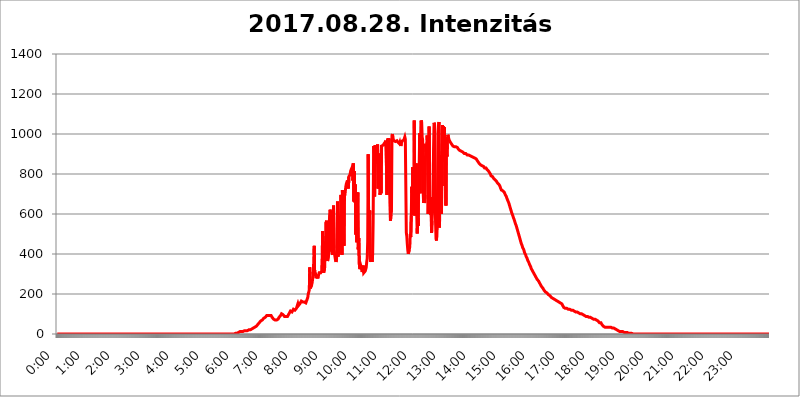
| Category | 2017.08.28. Intenzitás [W/m^2] |
|---|---|
| 0.0 | 0 |
| 0.0006944444444444445 | 0 |
| 0.001388888888888889 | 0 |
| 0.0020833333333333333 | 0 |
| 0.002777777777777778 | 0 |
| 0.003472222222222222 | 0 |
| 0.004166666666666667 | 0 |
| 0.004861111111111111 | 0 |
| 0.005555555555555556 | 0 |
| 0.0062499999999999995 | 0 |
| 0.006944444444444444 | 0 |
| 0.007638888888888889 | 0 |
| 0.008333333333333333 | 0 |
| 0.009027777777777779 | 0 |
| 0.009722222222222222 | 0 |
| 0.010416666666666666 | 0 |
| 0.011111111111111112 | 0 |
| 0.011805555555555555 | 0 |
| 0.012499999999999999 | 0 |
| 0.013194444444444444 | 0 |
| 0.013888888888888888 | 0 |
| 0.014583333333333332 | 0 |
| 0.015277777777777777 | 0 |
| 0.015972222222222224 | 0 |
| 0.016666666666666666 | 0 |
| 0.017361111111111112 | 0 |
| 0.018055555555555557 | 0 |
| 0.01875 | 0 |
| 0.019444444444444445 | 0 |
| 0.02013888888888889 | 0 |
| 0.020833333333333332 | 0 |
| 0.02152777777777778 | 0 |
| 0.022222222222222223 | 0 |
| 0.02291666666666667 | 0 |
| 0.02361111111111111 | 0 |
| 0.024305555555555556 | 0 |
| 0.024999999999999998 | 0 |
| 0.025694444444444447 | 0 |
| 0.02638888888888889 | 0 |
| 0.027083333333333334 | 0 |
| 0.027777777777777776 | 0 |
| 0.02847222222222222 | 0 |
| 0.029166666666666664 | 0 |
| 0.029861111111111113 | 0 |
| 0.030555555555555555 | 0 |
| 0.03125 | 0 |
| 0.03194444444444445 | 0 |
| 0.03263888888888889 | 0 |
| 0.03333333333333333 | 0 |
| 0.034027777777777775 | 0 |
| 0.034722222222222224 | 0 |
| 0.035416666666666666 | 0 |
| 0.036111111111111115 | 0 |
| 0.03680555555555556 | 0 |
| 0.0375 | 0 |
| 0.03819444444444444 | 0 |
| 0.03888888888888889 | 0 |
| 0.03958333333333333 | 0 |
| 0.04027777777777778 | 0 |
| 0.04097222222222222 | 0 |
| 0.041666666666666664 | 0 |
| 0.042361111111111106 | 0 |
| 0.04305555555555556 | 0 |
| 0.043750000000000004 | 0 |
| 0.044444444444444446 | 0 |
| 0.04513888888888889 | 0 |
| 0.04583333333333334 | 0 |
| 0.04652777777777778 | 0 |
| 0.04722222222222222 | 0 |
| 0.04791666666666666 | 0 |
| 0.04861111111111111 | 0 |
| 0.049305555555555554 | 0 |
| 0.049999999999999996 | 0 |
| 0.05069444444444445 | 0 |
| 0.051388888888888894 | 0 |
| 0.052083333333333336 | 0 |
| 0.05277777777777778 | 0 |
| 0.05347222222222222 | 0 |
| 0.05416666666666667 | 0 |
| 0.05486111111111111 | 0 |
| 0.05555555555555555 | 0 |
| 0.05625 | 0 |
| 0.05694444444444444 | 0 |
| 0.057638888888888885 | 0 |
| 0.05833333333333333 | 0 |
| 0.05902777777777778 | 0 |
| 0.059722222222222225 | 0 |
| 0.06041666666666667 | 0 |
| 0.061111111111111116 | 0 |
| 0.06180555555555556 | 0 |
| 0.0625 | 0 |
| 0.06319444444444444 | 0 |
| 0.06388888888888888 | 0 |
| 0.06458333333333334 | 0 |
| 0.06527777777777778 | 0 |
| 0.06597222222222222 | 0 |
| 0.06666666666666667 | 0 |
| 0.06736111111111111 | 0 |
| 0.06805555555555555 | 0 |
| 0.06874999999999999 | 0 |
| 0.06944444444444443 | 0 |
| 0.07013888888888889 | 0 |
| 0.07083333333333333 | 0 |
| 0.07152777777777779 | 0 |
| 0.07222222222222223 | 0 |
| 0.07291666666666667 | 0 |
| 0.07361111111111111 | 0 |
| 0.07430555555555556 | 0 |
| 0.075 | 0 |
| 0.07569444444444444 | 0 |
| 0.0763888888888889 | 0 |
| 0.07708333333333334 | 0 |
| 0.07777777777777778 | 0 |
| 0.07847222222222222 | 0 |
| 0.07916666666666666 | 0 |
| 0.0798611111111111 | 0 |
| 0.08055555555555556 | 0 |
| 0.08125 | 0 |
| 0.08194444444444444 | 0 |
| 0.08263888888888889 | 0 |
| 0.08333333333333333 | 0 |
| 0.08402777777777777 | 0 |
| 0.08472222222222221 | 0 |
| 0.08541666666666665 | 0 |
| 0.08611111111111112 | 0 |
| 0.08680555555555557 | 0 |
| 0.08750000000000001 | 0 |
| 0.08819444444444445 | 0 |
| 0.08888888888888889 | 0 |
| 0.08958333333333333 | 0 |
| 0.09027777777777778 | 0 |
| 0.09097222222222222 | 0 |
| 0.09166666666666667 | 0 |
| 0.09236111111111112 | 0 |
| 0.09305555555555556 | 0 |
| 0.09375 | 0 |
| 0.09444444444444444 | 0 |
| 0.09513888888888888 | 0 |
| 0.09583333333333333 | 0 |
| 0.09652777777777777 | 0 |
| 0.09722222222222222 | 0 |
| 0.09791666666666667 | 0 |
| 0.09861111111111111 | 0 |
| 0.09930555555555555 | 0 |
| 0.09999999999999999 | 0 |
| 0.10069444444444443 | 0 |
| 0.1013888888888889 | 0 |
| 0.10208333333333335 | 0 |
| 0.10277777777777779 | 0 |
| 0.10347222222222223 | 0 |
| 0.10416666666666667 | 0 |
| 0.10486111111111111 | 0 |
| 0.10555555555555556 | 0 |
| 0.10625 | 0 |
| 0.10694444444444444 | 0 |
| 0.1076388888888889 | 0 |
| 0.10833333333333334 | 0 |
| 0.10902777777777778 | 0 |
| 0.10972222222222222 | 0 |
| 0.1111111111111111 | 0 |
| 0.11180555555555556 | 0 |
| 0.11180555555555556 | 0 |
| 0.1125 | 0 |
| 0.11319444444444444 | 0 |
| 0.11388888888888889 | 0 |
| 0.11458333333333333 | 0 |
| 0.11527777777777777 | 0 |
| 0.11597222222222221 | 0 |
| 0.11666666666666665 | 0 |
| 0.1173611111111111 | 0 |
| 0.11805555555555557 | 0 |
| 0.11944444444444445 | 0 |
| 0.12013888888888889 | 0 |
| 0.12083333333333333 | 0 |
| 0.12152777777777778 | 0 |
| 0.12222222222222223 | 0 |
| 0.12291666666666667 | 0 |
| 0.12291666666666667 | 0 |
| 0.12361111111111112 | 0 |
| 0.12430555555555556 | 0 |
| 0.125 | 0 |
| 0.12569444444444444 | 0 |
| 0.12638888888888888 | 0 |
| 0.12708333333333333 | 0 |
| 0.16875 | 0 |
| 0.12847222222222224 | 0 |
| 0.12916666666666668 | 0 |
| 0.12986111111111112 | 0 |
| 0.13055555555555556 | 0 |
| 0.13125 | 0 |
| 0.13194444444444445 | 0 |
| 0.1326388888888889 | 0 |
| 0.13333333333333333 | 0 |
| 0.13402777777777777 | 0 |
| 0.13402777777777777 | 0 |
| 0.13472222222222222 | 0 |
| 0.13541666666666666 | 0 |
| 0.1361111111111111 | 0 |
| 0.13749999999999998 | 0 |
| 0.13819444444444443 | 0 |
| 0.1388888888888889 | 0 |
| 0.13958333333333334 | 0 |
| 0.14027777777777778 | 0 |
| 0.14097222222222222 | 0 |
| 0.14166666666666666 | 0 |
| 0.1423611111111111 | 0 |
| 0.14305555555555557 | 0 |
| 0.14375000000000002 | 0 |
| 0.14444444444444446 | 0 |
| 0.1451388888888889 | 0 |
| 0.1451388888888889 | 0 |
| 0.14652777777777778 | 0 |
| 0.14722222222222223 | 0 |
| 0.14791666666666667 | 0 |
| 0.1486111111111111 | 0 |
| 0.14930555555555555 | 0 |
| 0.15 | 0 |
| 0.15069444444444444 | 0 |
| 0.15138888888888888 | 0 |
| 0.15208333333333332 | 0 |
| 0.15277777777777776 | 0 |
| 0.15347222222222223 | 0 |
| 0.15416666666666667 | 0 |
| 0.15486111111111112 | 0 |
| 0.15555555555555556 | 0 |
| 0.15625 | 0 |
| 0.15694444444444444 | 0 |
| 0.15763888888888888 | 0 |
| 0.15833333333333333 | 0 |
| 0.15902777777777777 | 0 |
| 0.15972222222222224 | 0 |
| 0.16041666666666668 | 0 |
| 0.16111111111111112 | 0 |
| 0.16180555555555556 | 0 |
| 0.1625 | 0 |
| 0.16319444444444445 | 0 |
| 0.1638888888888889 | 0 |
| 0.16458333333333333 | 0 |
| 0.16527777777777777 | 0 |
| 0.16597222222222222 | 0 |
| 0.16666666666666666 | 0 |
| 0.1673611111111111 | 0 |
| 0.16805555555555554 | 0 |
| 0.16874999999999998 | 0 |
| 0.16944444444444443 | 0 |
| 0.17013888888888887 | 0 |
| 0.1708333333333333 | 0 |
| 0.17152777777777775 | 0 |
| 0.17222222222222225 | 0 |
| 0.1729166666666667 | 0 |
| 0.17361111111111113 | 0 |
| 0.17430555555555557 | 0 |
| 0.17500000000000002 | 0 |
| 0.17569444444444446 | 0 |
| 0.1763888888888889 | 0 |
| 0.17708333333333334 | 0 |
| 0.17777777777777778 | 0 |
| 0.17847222222222223 | 0 |
| 0.17916666666666667 | 0 |
| 0.1798611111111111 | 0 |
| 0.18055555555555555 | 0 |
| 0.18125 | 0 |
| 0.18194444444444444 | 0 |
| 0.1826388888888889 | 0 |
| 0.18333333333333335 | 0 |
| 0.1840277777777778 | 0 |
| 0.18472222222222223 | 0 |
| 0.18541666666666667 | 0 |
| 0.18611111111111112 | 0 |
| 0.18680555555555556 | 0 |
| 0.1875 | 0 |
| 0.18819444444444444 | 0 |
| 0.18888888888888888 | 0 |
| 0.18958333333333333 | 0 |
| 0.19027777777777777 | 0 |
| 0.1909722222222222 | 0 |
| 0.19166666666666665 | 0 |
| 0.19236111111111112 | 0 |
| 0.19305555555555554 | 0 |
| 0.19375 | 0 |
| 0.19444444444444445 | 0 |
| 0.1951388888888889 | 0 |
| 0.19583333333333333 | 0 |
| 0.19652777777777777 | 0 |
| 0.19722222222222222 | 0 |
| 0.19791666666666666 | 0 |
| 0.1986111111111111 | 0 |
| 0.19930555555555554 | 0 |
| 0.19999999999999998 | 0 |
| 0.20069444444444443 | 0 |
| 0.20138888888888887 | 0 |
| 0.2020833333333333 | 0 |
| 0.2027777777777778 | 0 |
| 0.2034722222222222 | 0 |
| 0.2041666666666667 | 0 |
| 0.20486111111111113 | 0 |
| 0.20555555555555557 | 0 |
| 0.20625000000000002 | 0 |
| 0.20694444444444446 | 0 |
| 0.2076388888888889 | 0 |
| 0.20833333333333334 | 0 |
| 0.20902777777777778 | 0 |
| 0.20972222222222223 | 0 |
| 0.21041666666666667 | 0 |
| 0.2111111111111111 | 0 |
| 0.21180555555555555 | 0 |
| 0.2125 | 0 |
| 0.21319444444444444 | 0 |
| 0.2138888888888889 | 0 |
| 0.21458333333333335 | 0 |
| 0.2152777777777778 | 0 |
| 0.21597222222222223 | 0 |
| 0.21666666666666667 | 0 |
| 0.21736111111111112 | 0 |
| 0.21805555555555556 | 0 |
| 0.21875 | 0 |
| 0.21944444444444444 | 0 |
| 0.22013888888888888 | 0 |
| 0.22083333333333333 | 0 |
| 0.22152777777777777 | 0 |
| 0.2222222222222222 | 0 |
| 0.22291666666666665 | 0 |
| 0.2236111111111111 | 0 |
| 0.22430555555555556 | 0 |
| 0.225 | 0 |
| 0.22569444444444445 | 0 |
| 0.2263888888888889 | 0 |
| 0.22708333333333333 | 0 |
| 0.22777777777777777 | 0 |
| 0.22847222222222222 | 0 |
| 0.22916666666666666 | 0 |
| 0.2298611111111111 | 0 |
| 0.23055555555555554 | 0 |
| 0.23124999999999998 | 0 |
| 0.23194444444444443 | 0 |
| 0.23263888888888887 | 0 |
| 0.2333333333333333 | 0 |
| 0.2340277777777778 | 0 |
| 0.2347222222222222 | 0 |
| 0.2354166666666667 | 0 |
| 0.23611111111111113 | 0 |
| 0.23680555555555557 | 0 |
| 0.23750000000000002 | 0 |
| 0.23819444444444446 | 0 |
| 0.2388888888888889 | 0 |
| 0.23958333333333334 | 0 |
| 0.24027777777777778 | 0 |
| 0.24097222222222223 | 0 |
| 0.24166666666666667 | 0 |
| 0.2423611111111111 | 0 |
| 0.24305555555555555 | 0 |
| 0.24375 | 0 |
| 0.24444444444444446 | 0 |
| 0.24513888888888888 | 0 |
| 0.24583333333333335 | 0 |
| 0.2465277777777778 | 0 |
| 0.24722222222222223 | 0 |
| 0.24791666666666667 | 0 |
| 0.24861111111111112 | 0 |
| 0.24930555555555556 | 3.525 |
| 0.25 | 3.525 |
| 0.25069444444444444 | 3.525 |
| 0.2513888888888889 | 3.525 |
| 0.2520833333333333 | 3.525 |
| 0.25277777777777777 | 3.525 |
| 0.2534722222222222 | 3.525 |
| 0.25416666666666665 | 7.887 |
| 0.2548611111111111 | 7.887 |
| 0.2555555555555556 | 7.887 |
| 0.25625000000000003 | 12.257 |
| 0.2569444444444445 | 12.257 |
| 0.2576388888888889 | 12.257 |
| 0.25833333333333336 | 12.257 |
| 0.2590277777777778 | 12.257 |
| 0.25972222222222224 | 12.257 |
| 0.2604166666666667 | 12.257 |
| 0.2611111111111111 | 16.636 |
| 0.26180555555555557 | 16.636 |
| 0.2625 | 16.636 |
| 0.26319444444444445 | 16.636 |
| 0.2638888888888889 | 16.636 |
| 0.26458333333333334 | 16.636 |
| 0.2652777777777778 | 16.636 |
| 0.2659722222222222 | 16.636 |
| 0.26666666666666666 | 16.636 |
| 0.2673611111111111 | 21.024 |
| 0.26805555555555555 | 21.024 |
| 0.26875 | 21.024 |
| 0.26944444444444443 | 21.024 |
| 0.2701388888888889 | 21.024 |
| 0.2708333333333333 | 21.024 |
| 0.27152777777777776 | 25.419 |
| 0.2722222222222222 | 25.419 |
| 0.27291666666666664 | 25.419 |
| 0.2736111111111111 | 29.823 |
| 0.2743055555555555 | 29.823 |
| 0.27499999999999997 | 29.823 |
| 0.27569444444444446 | 34.234 |
| 0.27638888888888885 | 34.234 |
| 0.27708333333333335 | 34.234 |
| 0.2777777777777778 | 38.653 |
| 0.27847222222222223 | 38.653 |
| 0.2791666666666667 | 38.653 |
| 0.2798611111111111 | 43.079 |
| 0.28055555555555556 | 43.079 |
| 0.28125 | 47.511 |
| 0.28194444444444444 | 51.951 |
| 0.2826388888888889 | 51.951 |
| 0.2833333333333333 | 56.398 |
| 0.28402777777777777 | 60.85 |
| 0.2847222222222222 | 60.85 |
| 0.28541666666666665 | 65.31 |
| 0.28611111111111115 | 65.31 |
| 0.28680555555555554 | 69.775 |
| 0.28750000000000003 | 69.775 |
| 0.2881944444444445 | 74.246 |
| 0.2888888888888889 | 74.246 |
| 0.28958333333333336 | 78.722 |
| 0.2902777777777778 | 83.205 |
| 0.29097222222222224 | 83.205 |
| 0.2916666666666667 | 83.205 |
| 0.2923611111111111 | 87.692 |
| 0.29305555555555557 | 87.692 |
| 0.29375 | 92.184 |
| 0.29444444444444445 | 87.692 |
| 0.2951388888888889 | 87.692 |
| 0.29583333333333334 | 92.184 |
| 0.2965277777777778 | 92.184 |
| 0.2972222222222222 | 92.184 |
| 0.29791666666666666 | 92.184 |
| 0.2986111111111111 | 96.682 |
| 0.29930555555555555 | 96.682 |
| 0.3 | 92.184 |
| 0.30069444444444443 | 87.692 |
| 0.3013888888888889 | 83.205 |
| 0.3020833333333333 | 83.205 |
| 0.30277777777777776 | 78.722 |
| 0.3034722222222222 | 74.246 |
| 0.30416666666666664 | 69.775 |
| 0.3048611111111111 | 69.775 |
| 0.3055555555555555 | 69.775 |
| 0.30624999999999997 | 69.775 |
| 0.3069444444444444 | 69.775 |
| 0.3076388888888889 | 69.775 |
| 0.30833333333333335 | 69.775 |
| 0.3090277777777778 | 74.246 |
| 0.30972222222222223 | 74.246 |
| 0.3104166666666667 | 78.722 |
| 0.3111111111111111 | 83.205 |
| 0.31180555555555556 | 83.205 |
| 0.3125 | 87.692 |
| 0.31319444444444444 | 92.184 |
| 0.3138888888888889 | 96.682 |
| 0.3145833333333333 | 101.184 |
| 0.31527777777777777 | 101.184 |
| 0.3159722222222222 | 101.184 |
| 0.31666666666666665 | 96.682 |
| 0.31736111111111115 | 92.184 |
| 0.31805555555555554 | 92.184 |
| 0.31875000000000003 | 87.692 |
| 0.3194444444444445 | 87.692 |
| 0.3201388888888889 | 87.692 |
| 0.32083333333333336 | 87.692 |
| 0.3215277777777778 | 87.692 |
| 0.32222222222222224 | 87.692 |
| 0.3229166666666667 | 87.692 |
| 0.3236111111111111 | 92.184 |
| 0.32430555555555557 | 96.682 |
| 0.325 | 101.184 |
| 0.32569444444444445 | 105.69 |
| 0.3263888888888889 | 110.201 |
| 0.32708333333333334 | 114.716 |
| 0.3277777777777778 | 114.716 |
| 0.3284722222222222 | 110.201 |
| 0.32916666666666666 | 110.201 |
| 0.3298611111111111 | 110.201 |
| 0.33055555555555555 | 110.201 |
| 0.33125 | 123.758 |
| 0.33194444444444443 | 119.235 |
| 0.3326388888888889 | 119.235 |
| 0.3333333333333333 | 119.235 |
| 0.3340277777777778 | 119.235 |
| 0.3347222222222222 | 123.758 |
| 0.3354166666666667 | 128.284 |
| 0.3361111111111111 | 128.284 |
| 0.3368055555555556 | 132.814 |
| 0.33749999999999997 | 150.964 |
| 0.33819444444444446 | 141.884 |
| 0.33888888888888885 | 146.423 |
| 0.33958333333333335 | 146.423 |
| 0.34027777777777773 | 150.964 |
| 0.34097222222222223 | 150.964 |
| 0.3416666666666666 | 155.509 |
| 0.3423611111111111 | 164.605 |
| 0.3430555555555555 | 160.056 |
| 0.34375 | 160.056 |
| 0.3444444444444445 | 160.056 |
| 0.3451388888888889 | 155.509 |
| 0.3458333333333334 | 160.056 |
| 0.34652777777777777 | 160.056 |
| 0.34722222222222227 | 164.605 |
| 0.34791666666666665 | 155.509 |
| 0.34861111111111115 | 155.509 |
| 0.34930555555555554 | 160.056 |
| 0.35000000000000003 | 169.156 |
| 0.3506944444444444 | 173.709 |
| 0.3513888888888889 | 182.82 |
| 0.3520833333333333 | 201.058 |
| 0.3527777777777778 | 210.182 |
| 0.3534722222222222 | 219.309 |
| 0.3541666666666667 | 333.113 |
| 0.3548611111111111 | 228.436 |
| 0.35555555555555557 | 228.436 |
| 0.35625 | 233 |
| 0.35694444444444445 | 246.689 |
| 0.3576388888888889 | 260.373 |
| 0.35833333333333334 | 278.603 |
| 0.3590277777777778 | 292.259 |
| 0.3597222222222222 | 364.728 |
| 0.36041666666666666 | 440.702 |
| 0.3611111111111111 | 292.259 |
| 0.36180555555555555 | 305.898 |
| 0.3625 | 292.259 |
| 0.36319444444444443 | 278.603 |
| 0.3638888888888889 | 287.709 |
| 0.3645833333333333 | 296.808 |
| 0.3652777777777778 | 278.603 |
| 0.3659722222222222 | 287.709 |
| 0.3666666666666667 | 292.259 |
| 0.3673611111111111 | 305.898 |
| 0.3680555555555556 | 305.898 |
| 0.36874999999999997 | 301.354 |
| 0.36944444444444446 | 305.898 |
| 0.37013888888888885 | 310.44 |
| 0.37083333333333335 | 314.98 |
| 0.37152777777777773 | 378.224 |
| 0.37222222222222223 | 515.223 |
| 0.3729166666666666 | 319.517 |
| 0.3736111111111111 | 305.898 |
| 0.3743055555555555 | 305.898 |
| 0.375 | 328.584 |
| 0.3756944444444445 | 462.786 |
| 0.3763888888888889 | 409.574 |
| 0.3770833333333334 | 558.261 |
| 0.37777777777777777 | 566.793 |
| 0.37847222222222227 | 378.224 |
| 0.37916666666666665 | 364.728 |
| 0.37986111111111115 | 364.728 |
| 0.38055555555555554 | 396.164 |
| 0.38125000000000003 | 502.192 |
| 0.3819444444444444 | 592.233 |
| 0.3826388888888889 | 621.613 |
| 0.3833333333333333 | 609.062 |
| 0.3840277777777778 | 475.972 |
| 0.3847222222222222 | 414.035 |
| 0.3854166666666667 | 409.574 |
| 0.3861111111111111 | 396.164 |
| 0.38680555555555557 | 528.2 |
| 0.3875 | 642.4 |
| 0.38819444444444445 | 427.39 |
| 0.3888888888888889 | 400.638 |
| 0.38958333333333334 | 400.638 |
| 0.3902777777777778 | 369.23 |
| 0.3909722222222222 | 360.221 |
| 0.39166666666666666 | 373.729 |
| 0.3923611111111111 | 449.551 |
| 0.39305555555555555 | 663.019 |
| 0.39375 | 387.202 |
| 0.39444444444444443 | 414.035 |
| 0.3951388888888889 | 400.638 |
| 0.3958333333333333 | 431.833 |
| 0.3965277777777778 | 528.2 |
| 0.3972222222222222 | 579.542 |
| 0.3979166666666667 | 695.666 |
| 0.3986111111111111 | 691.608 |
| 0.3993055555555556 | 396.164 |
| 0.39999999999999997 | 719.877 |
| 0.40069444444444446 | 475.972 |
| 0.40138888888888885 | 642.4 |
| 0.40208333333333335 | 440.702 |
| 0.40277777777777773 | 687.544 |
| 0.40347222222222223 | 695.666 |
| 0.4041666666666666 | 719.877 |
| 0.4048611111111111 | 739.877 |
| 0.4055555555555555 | 751.803 |
| 0.40625 | 759.723 |
| 0.4069444444444445 | 767.62 |
| 0.4076388888888889 | 771.559 |
| 0.4083333333333334 | 727.896 |
| 0.40902777777777777 | 787.258 |
| 0.40972222222222227 | 787.258 |
| 0.41041666666666665 | 795.074 |
| 0.41111111111111115 | 798.974 |
| 0.41180555555555554 | 818.392 |
| 0.41250000000000003 | 822.26 |
| 0.4131944444444444 | 829.981 |
| 0.4138888888888889 | 818.392 |
| 0.4145833333333333 | 767.62 |
| 0.4152777777777778 | 853.029 |
| 0.4159722222222222 | 663.019 |
| 0.4166666666666667 | 814.519 |
| 0.4173611111111111 | 658.909 |
| 0.41805555555555557 | 747.834 |
| 0.41875 | 497.836 |
| 0.41944444444444445 | 707.8 |
| 0.4201388888888889 | 458.38 |
| 0.42083333333333334 | 458.38 |
| 0.4215277777777778 | 707.8 |
| 0.4222222222222222 | 422.943 |
| 0.42291666666666666 | 480.356 |
| 0.4236111111111111 | 351.198 |
| 0.42430555555555555 | 324.052 |
| 0.425 | 328.584 |
| 0.42569444444444443 | 342.162 |
| 0.4263888888888889 | 333.113 |
| 0.4270833333333333 | 319.517 |
| 0.4277777777777778 | 310.44 |
| 0.4284722222222222 | 314.98 |
| 0.4291666666666667 | 342.162 |
| 0.4298611111111111 | 305.898 |
| 0.4305555555555556 | 305.898 |
| 0.43124999999999997 | 310.44 |
| 0.43194444444444446 | 314.98 |
| 0.43263888888888885 | 314.98 |
| 0.43333333333333335 | 333.113 |
| 0.43402777777777773 | 360.221 |
| 0.43472222222222223 | 378.224 |
| 0.4354166666666666 | 462.786 |
| 0.4361111111111111 | 898.668 |
| 0.4368055555555555 | 523.88 |
| 0.4375 | 480.356 |
| 0.4381944444444445 | 617.436 |
| 0.4388888888888889 | 387.202 |
| 0.4395833333333334 | 360.221 |
| 0.44027777777777777 | 400.638 |
| 0.44097222222222227 | 378.224 |
| 0.44166666666666665 | 360.221 |
| 0.44236111111111115 | 400.638 |
| 0.44305555555555554 | 558.261 |
| 0.44375000000000003 | 940.082 |
| 0.4444444444444444 | 902.447 |
| 0.4451388888888889 | 687.544 |
| 0.4458333333333333 | 943.832 |
| 0.4465277777777778 | 853.029 |
| 0.4472222222222222 | 936.33 |
| 0.4479166666666667 | 940.082 |
| 0.4486111111111111 | 853.029 |
| 0.44930555555555557 | 947.58 |
| 0.45 | 727.896 |
| 0.45069444444444445 | 829.981 |
| 0.4513888888888889 | 902.447 |
| 0.45208333333333334 | 891.099 |
| 0.4527777777777778 | 695.666 |
| 0.4534722222222222 | 791.169 |
| 0.45416666666666666 | 703.762 |
| 0.4548611111111111 | 940.082 |
| 0.45555555555555555 | 940.082 |
| 0.45625 | 943.832 |
| 0.45694444444444443 | 943.832 |
| 0.4576388888888889 | 943.832 |
| 0.4583333333333333 | 940.082 |
| 0.4590277777777778 | 955.071 |
| 0.4597222222222222 | 955.071 |
| 0.4604166666666667 | 940.082 |
| 0.4611111111111111 | 966.295 |
| 0.4618055555555556 | 966.295 |
| 0.46249999999999997 | 695.666 |
| 0.46319444444444446 | 970.034 |
| 0.46388888888888885 | 977.508 |
| 0.46458333333333335 | 958.814 |
| 0.46527777777777773 | 977.508 |
| 0.46597222222222223 | 977.508 |
| 0.4666666666666666 | 977.508 |
| 0.4673611111111111 | 566.793 |
| 0.4680555555555555 | 596.45 |
| 0.46875 | 613.252 |
| 0.4694444444444445 | 992.448 |
| 0.4701388888888889 | 999.916 |
| 0.4708333333333334 | 977.508 |
| 0.47152777777777777 | 973.772 |
| 0.47222222222222227 | 966.295 |
| 0.47291666666666665 | 966.295 |
| 0.47361111111111115 | 966.295 |
| 0.47430555555555554 | 962.555 |
| 0.47500000000000003 | 966.295 |
| 0.4756944444444444 | 966.295 |
| 0.4763888888888889 | 966.295 |
| 0.4770833333333333 | 962.555 |
| 0.4777777777777778 | 958.814 |
| 0.4784722222222222 | 958.814 |
| 0.4791666666666667 | 955.071 |
| 0.4798611111111111 | 951.327 |
| 0.48055555555555557 | 958.814 |
| 0.48125 | 955.071 |
| 0.48194444444444445 | 940.082 |
| 0.4826388888888889 | 955.071 |
| 0.48333333333333334 | 955.071 |
| 0.4840277777777778 | 966.295 |
| 0.4847222222222222 | 962.555 |
| 0.48541666666666666 | 970.034 |
| 0.4861111111111111 | 970.034 |
| 0.48680555555555555 | 973.772 |
| 0.4875 | 984.98 |
| 0.48819444444444443 | 973.772 |
| 0.4888888888888889 | 977.508 |
| 0.4895833333333333 | 506.542 |
| 0.4902777777777778 | 489.108 |
| 0.4909722222222222 | 449.551 |
| 0.4916666666666667 | 418.492 |
| 0.4923611111111111 | 400.638 |
| 0.4930555555555556 | 405.108 |
| 0.49374999999999997 | 422.943 |
| 0.49444444444444446 | 436.27 |
| 0.49513888888888885 | 497.836 |
| 0.49583333333333335 | 484.735 |
| 0.49652777777777773 | 592.233 |
| 0.49722222222222223 | 735.89 |
| 0.4979166666666666 | 596.45 |
| 0.4986111111111111 | 833.834 |
| 0.4993055555555555 | 596.45 |
| 0.5 | 663.019 |
| 0.5006944444444444 | 1067.267 |
| 0.5013888888888889 | 592.233 |
| 0.5020833333333333 | 822.26 |
| 0.5027777777777778 | 763.674 |
| 0.5034722222222222 | 853.029 |
| 0.5041666666666667 | 609.062 |
| 0.5048611111111111 | 502.192 |
| 0.5055555555555555 | 579.542 |
| 0.50625 | 541.121 |
| 0.5069444444444444 | 810.641 |
| 0.5076388888888889 | 837.682 |
| 0.5083333333333333 | 1003.65 |
| 0.5090277777777777 | 703.762 |
| 0.5097222222222222 | 703.762 |
| 0.5104166666666666 | 1067.267 |
| 0.5111111111111112 | 1059.756 |
| 0.5118055555555555 | 984.98 |
| 0.5125000000000001 | 970.034 |
| 0.5131944444444444 | 711.832 |
| 0.513888888888889 | 654.791 |
| 0.5145833333333333 | 814.519 |
| 0.5152777777777778 | 654.791 |
| 0.5159722222222222 | 695.666 |
| 0.5166666666666667 | 951.327 |
| 0.517361111111111 | 909.996 |
| 0.5180555555555556 | 928.819 |
| 0.5187499999999999 | 992.448 |
| 0.5194444444444445 | 951.327 |
| 0.5201388888888888 | 600.661 |
| 0.5208333333333334 | 695.666 |
| 0.5215277777777778 | 1037.277 |
| 0.5222222222222223 | 837.682 |
| 0.5229166666666667 | 604.864 |
| 0.5236111111111111 | 596.45 |
| 0.5243055555555556 | 683.473 |
| 0.525 | 506.542 |
| 0.5256944444444445 | 566.793 |
| 0.5263888888888889 | 562.53 |
| 0.5270833333333333 | 658.909 |
| 0.5277777777777778 | 925.06 |
| 0.5284722222222222 | 1056.004 |
| 0.5291666666666667 | 1048.508 |
| 0.5298611111111111 | 1007.383 |
| 0.5305555555555556 | 566.793 |
| 0.53125 | 475.972 |
| 0.5319444444444444 | 467.187 |
| 0.5326388888888889 | 541.121 |
| 0.5333333333333333 | 545.416 |
| 0.5340277777777778 | 864.493 |
| 0.5347222222222222 | 1044.762 |
| 0.5354166666666667 | 1059.756 |
| 0.5361111111111111 | 532.513 |
| 0.5368055555555555 | 894.885 |
| 0.5375 | 868.305 |
| 0.5381944444444444 | 617.436 |
| 0.5388888888888889 | 600.661 |
| 0.5395833333333333 | 913.766 |
| 0.5402777777777777 | 1044.762 |
| 0.5409722222222222 | 860.676 |
| 0.5416666666666666 | 1037.277 |
| 0.5423611111111112 | 1022.323 |
| 0.5430555555555555 | 1033.537 |
| 0.5437500000000001 | 739.877 |
| 0.5444444444444444 | 909.996 |
| 0.545138888888889 | 642.4 |
| 0.5458333333333333 | 984.98 |
| 0.5465277777777778 | 887.309 |
| 0.5472222222222222 | 973.772 |
| 0.5479166666666667 | 996.182 |
| 0.548611111111111 | 984.98 |
| 0.5493055555555556 | 973.772 |
| 0.5499999999999999 | 970.034 |
| 0.5506944444444445 | 962.555 |
| 0.5513888888888888 | 958.814 |
| 0.5520833333333334 | 955.071 |
| 0.5527777777777778 | 951.327 |
| 0.5534722222222223 | 947.58 |
| 0.5541666666666667 | 943.832 |
| 0.5548611111111111 | 940.082 |
| 0.5555555555555556 | 936.33 |
| 0.55625 | 936.33 |
| 0.5569444444444445 | 936.33 |
| 0.5576388888888889 | 936.33 |
| 0.5583333333333333 | 936.33 |
| 0.5590277777777778 | 936.33 |
| 0.5597222222222222 | 936.33 |
| 0.5604166666666667 | 932.576 |
| 0.5611111111111111 | 932.576 |
| 0.5618055555555556 | 928.819 |
| 0.5625 | 925.06 |
| 0.5631944444444444 | 925.06 |
| 0.5638888888888889 | 921.298 |
| 0.5645833333333333 | 917.534 |
| 0.5652777777777778 | 917.534 |
| 0.5659722222222222 | 913.766 |
| 0.5666666666666667 | 913.766 |
| 0.5673611111111111 | 909.996 |
| 0.5680555555555555 | 909.996 |
| 0.56875 | 909.996 |
| 0.5694444444444444 | 906.223 |
| 0.5701388888888889 | 906.223 |
| 0.5708333333333333 | 902.447 |
| 0.5715277777777777 | 902.447 |
| 0.5722222222222222 | 902.447 |
| 0.5729166666666666 | 902.447 |
| 0.5736111111111112 | 902.447 |
| 0.5743055555555555 | 898.668 |
| 0.5750000000000001 | 894.885 |
| 0.5756944444444444 | 894.885 |
| 0.576388888888889 | 894.885 |
| 0.5770833333333333 | 894.885 |
| 0.5777777777777778 | 894.885 |
| 0.5784722222222222 | 891.099 |
| 0.5791666666666667 | 891.099 |
| 0.579861111111111 | 891.099 |
| 0.5805555555555556 | 891.099 |
| 0.5812499999999999 | 887.309 |
| 0.5819444444444445 | 887.309 |
| 0.5826388888888888 | 887.309 |
| 0.5833333333333334 | 883.516 |
| 0.5840277777777778 | 883.516 |
| 0.5847222222222223 | 883.516 |
| 0.5854166666666667 | 879.719 |
| 0.5861111111111111 | 875.918 |
| 0.5868055555555556 | 875.918 |
| 0.5875 | 875.918 |
| 0.5881944444444445 | 872.114 |
| 0.5888888888888889 | 868.305 |
| 0.5895833333333333 | 868.305 |
| 0.5902777777777778 | 860.676 |
| 0.5909722222222222 | 856.855 |
| 0.5916666666666667 | 853.029 |
| 0.5923611111111111 | 849.199 |
| 0.5930555555555556 | 849.199 |
| 0.59375 | 845.365 |
| 0.5944444444444444 | 845.365 |
| 0.5951388888888889 | 841.526 |
| 0.5958333333333333 | 841.526 |
| 0.5965277777777778 | 837.682 |
| 0.5972222222222222 | 837.682 |
| 0.5979166666666667 | 837.682 |
| 0.5986111111111111 | 833.834 |
| 0.5993055555555555 | 829.981 |
| 0.6 | 829.981 |
| 0.6006944444444444 | 829.981 |
| 0.6013888888888889 | 829.981 |
| 0.6020833333333333 | 826.123 |
| 0.6027777777777777 | 822.26 |
| 0.6034722222222222 | 822.26 |
| 0.6041666666666666 | 818.392 |
| 0.6048611111111112 | 814.519 |
| 0.6055555555555555 | 810.641 |
| 0.6062500000000001 | 806.757 |
| 0.6069444444444444 | 802.868 |
| 0.607638888888889 | 798.974 |
| 0.6083333333333333 | 791.169 |
| 0.6090277777777778 | 791.169 |
| 0.6097222222222222 | 791.169 |
| 0.6104166666666667 | 787.258 |
| 0.611111111111111 | 783.342 |
| 0.6118055555555556 | 779.42 |
| 0.6124999999999999 | 779.42 |
| 0.6131944444444445 | 775.492 |
| 0.6138888888888888 | 771.559 |
| 0.6145833333333334 | 767.62 |
| 0.6152777777777778 | 767.62 |
| 0.6159722222222223 | 763.674 |
| 0.6166666666666667 | 759.723 |
| 0.6173611111111111 | 755.766 |
| 0.6180555555555556 | 755.766 |
| 0.61875 | 751.803 |
| 0.6194444444444445 | 747.834 |
| 0.6201388888888889 | 743.859 |
| 0.6208333333333333 | 739.877 |
| 0.6215277777777778 | 731.896 |
| 0.6222222222222222 | 727.896 |
| 0.6229166666666667 | 719.877 |
| 0.6236111111111111 | 719.877 |
| 0.6243055555555556 | 715.858 |
| 0.625 | 715.858 |
| 0.6256944444444444 | 715.858 |
| 0.6263888888888889 | 711.832 |
| 0.6270833333333333 | 707.8 |
| 0.6277777777777778 | 703.762 |
| 0.6284722222222222 | 695.666 |
| 0.6291666666666667 | 691.608 |
| 0.6298611111111111 | 687.544 |
| 0.6305555555555555 | 679.395 |
| 0.63125 | 675.311 |
| 0.6319444444444444 | 667.123 |
| 0.6326388888888889 | 663.019 |
| 0.6333333333333333 | 654.791 |
| 0.6340277777777777 | 650.667 |
| 0.6347222222222222 | 638.256 |
| 0.6354166666666666 | 634.105 |
| 0.6361111111111112 | 621.613 |
| 0.6368055555555555 | 613.252 |
| 0.6375000000000001 | 604.864 |
| 0.6381944444444444 | 600.661 |
| 0.638888888888889 | 592.233 |
| 0.6395833333333333 | 583.779 |
| 0.6402777777777778 | 579.542 |
| 0.6409722222222222 | 571.049 |
| 0.6416666666666667 | 562.53 |
| 0.642361111111111 | 553.986 |
| 0.6430555555555556 | 549.704 |
| 0.6437499999999999 | 541.121 |
| 0.6444444444444445 | 532.513 |
| 0.6451388888888888 | 523.88 |
| 0.6458333333333334 | 515.223 |
| 0.6465277777777778 | 506.542 |
| 0.6472222222222223 | 497.836 |
| 0.6479166666666667 | 489.108 |
| 0.6486111111111111 | 480.356 |
| 0.6493055555555556 | 471.582 |
| 0.65 | 462.786 |
| 0.6506944444444445 | 453.968 |
| 0.6513888888888889 | 449.551 |
| 0.6520833333333333 | 440.702 |
| 0.6527777777777778 | 431.833 |
| 0.6534722222222222 | 427.39 |
| 0.6541666666666667 | 422.943 |
| 0.6548611111111111 | 414.035 |
| 0.6555555555555556 | 405.108 |
| 0.65625 | 400.638 |
| 0.6569444444444444 | 396.164 |
| 0.6576388888888889 | 387.202 |
| 0.6583333333333333 | 382.715 |
| 0.6590277777777778 | 378.224 |
| 0.6597222222222222 | 369.23 |
| 0.6604166666666667 | 364.728 |
| 0.6611111111111111 | 360.221 |
| 0.6618055555555555 | 355.712 |
| 0.6625 | 346.682 |
| 0.6631944444444444 | 342.162 |
| 0.6638888888888889 | 337.639 |
| 0.6645833333333333 | 328.584 |
| 0.6652777777777777 | 324.052 |
| 0.6659722222222222 | 319.517 |
| 0.6666666666666666 | 314.98 |
| 0.6673611111111111 | 310.44 |
| 0.6680555555555556 | 305.898 |
| 0.6687500000000001 | 301.354 |
| 0.6694444444444444 | 296.808 |
| 0.6701388888888888 | 292.259 |
| 0.6708333333333334 | 287.709 |
| 0.6715277777777778 | 283.156 |
| 0.6722222222222222 | 278.603 |
| 0.6729166666666666 | 274.047 |
| 0.6736111111111112 | 269.49 |
| 0.6743055555555556 | 269.49 |
| 0.6749999999999999 | 264.932 |
| 0.6756944444444444 | 260.373 |
| 0.6763888888888889 | 255.813 |
| 0.6770833333333334 | 251.251 |
| 0.6777777777777777 | 246.689 |
| 0.6784722222222223 | 242.127 |
| 0.6791666666666667 | 237.564 |
| 0.6798611111111111 | 233 |
| 0.6805555555555555 | 233 |
| 0.68125 | 228.436 |
| 0.6819444444444445 | 223.873 |
| 0.6826388888888889 | 219.309 |
| 0.6833333333333332 | 219.309 |
| 0.6840277777777778 | 214.746 |
| 0.6847222222222222 | 210.182 |
| 0.6854166666666667 | 210.182 |
| 0.686111111111111 | 210.182 |
| 0.6868055555555556 | 205.62 |
| 0.6875 | 201.058 |
| 0.6881944444444444 | 201.058 |
| 0.688888888888889 | 196.497 |
| 0.6895833333333333 | 196.497 |
| 0.6902777777777778 | 191.937 |
| 0.6909722222222222 | 191.937 |
| 0.6916666666666668 | 191.937 |
| 0.6923611111111111 | 187.378 |
| 0.6930555555555555 | 182.82 |
| 0.69375 | 182.82 |
| 0.6944444444444445 | 182.82 |
| 0.6951388888888889 | 178.264 |
| 0.6958333333333333 | 178.264 |
| 0.6965277777777777 | 178.264 |
| 0.6972222222222223 | 173.709 |
| 0.6979166666666666 | 173.709 |
| 0.6986111111111111 | 169.156 |
| 0.6993055555555556 | 169.156 |
| 0.7000000000000001 | 169.156 |
| 0.7006944444444444 | 164.605 |
| 0.7013888888888888 | 164.605 |
| 0.7020833333333334 | 164.605 |
| 0.7027777777777778 | 160.056 |
| 0.7034722222222222 | 160.056 |
| 0.7041666666666666 | 160.056 |
| 0.7048611111111112 | 155.509 |
| 0.7055555555555556 | 155.509 |
| 0.7062499999999999 | 150.964 |
| 0.7069444444444444 | 150.964 |
| 0.7076388888888889 | 150.964 |
| 0.7083333333333334 | 146.423 |
| 0.7090277777777777 | 141.884 |
| 0.7097222222222223 | 137.347 |
| 0.7104166666666667 | 132.814 |
| 0.7111111111111111 | 132.814 |
| 0.7118055555555555 | 132.814 |
| 0.7125 | 128.284 |
| 0.7131944444444445 | 128.284 |
| 0.7138888888888889 | 128.284 |
| 0.7145833333333332 | 128.284 |
| 0.7152777777777778 | 128.284 |
| 0.7159722222222222 | 128.284 |
| 0.7166666666666667 | 123.758 |
| 0.717361111111111 | 123.758 |
| 0.7180555555555556 | 123.758 |
| 0.71875 | 123.758 |
| 0.7194444444444444 | 123.758 |
| 0.720138888888889 | 119.235 |
| 0.7208333333333333 | 119.235 |
| 0.7215277777777778 | 119.235 |
| 0.7222222222222222 | 119.235 |
| 0.7229166666666668 | 119.235 |
| 0.7236111111111111 | 114.716 |
| 0.7243055555555555 | 114.716 |
| 0.725 | 114.716 |
| 0.7256944444444445 | 114.716 |
| 0.7263888888888889 | 114.716 |
| 0.7270833333333333 | 110.201 |
| 0.7277777777777777 | 110.201 |
| 0.7284722222222223 | 110.201 |
| 0.7291666666666666 | 110.201 |
| 0.7298611111111111 | 110.201 |
| 0.7305555555555556 | 105.69 |
| 0.7312500000000001 | 105.69 |
| 0.7319444444444444 | 105.69 |
| 0.7326388888888888 | 105.69 |
| 0.7333333333333334 | 101.184 |
| 0.7340277777777778 | 101.184 |
| 0.7347222222222222 | 101.184 |
| 0.7354166666666666 | 101.184 |
| 0.7361111111111112 | 96.682 |
| 0.7368055555555556 | 96.682 |
| 0.7374999999999999 | 96.682 |
| 0.7381944444444444 | 92.184 |
| 0.7388888888888889 | 92.184 |
| 0.7395833333333334 | 92.184 |
| 0.7402777777777777 | 92.184 |
| 0.7409722222222223 | 92.184 |
| 0.7416666666666667 | 87.692 |
| 0.7423611111111111 | 87.692 |
| 0.7430555555555555 | 87.692 |
| 0.74375 | 87.692 |
| 0.7444444444444445 | 83.205 |
| 0.7451388888888889 | 83.205 |
| 0.7458333333333332 | 83.205 |
| 0.7465277777777778 | 83.205 |
| 0.7472222222222222 | 83.205 |
| 0.7479166666666667 | 83.205 |
| 0.748611111111111 | 78.722 |
| 0.7493055555555556 | 78.722 |
| 0.75 | 78.722 |
| 0.7506944444444444 | 78.722 |
| 0.751388888888889 | 78.722 |
| 0.7520833333333333 | 74.246 |
| 0.7527777777777778 | 74.246 |
| 0.7534722222222222 | 74.246 |
| 0.7541666666666668 | 74.246 |
| 0.7548611111111111 | 74.246 |
| 0.7555555555555555 | 69.775 |
| 0.75625 | 69.775 |
| 0.7569444444444445 | 69.775 |
| 0.7576388888888889 | 69.775 |
| 0.7583333333333333 | 65.31 |
| 0.7590277777777777 | 65.31 |
| 0.7597222222222223 | 60.85 |
| 0.7604166666666666 | 56.398 |
| 0.7611111111111111 | 60.85 |
| 0.7618055555555556 | 60.85 |
| 0.7625000000000001 | 56.398 |
| 0.7631944444444444 | 51.951 |
| 0.7638888888888888 | 47.511 |
| 0.7645833333333334 | 47.511 |
| 0.7652777777777778 | 43.079 |
| 0.7659722222222222 | 38.653 |
| 0.7666666666666666 | 34.234 |
| 0.7673611111111112 | 34.234 |
| 0.7680555555555556 | 34.234 |
| 0.7687499999999999 | 34.234 |
| 0.7694444444444444 | 34.234 |
| 0.7701388888888889 | 34.234 |
| 0.7708333333333334 | 34.234 |
| 0.7715277777777777 | 29.823 |
| 0.7722222222222223 | 34.234 |
| 0.7729166666666667 | 34.234 |
| 0.7736111111111111 | 34.234 |
| 0.7743055555555555 | 34.234 |
| 0.775 | 34.234 |
| 0.7756944444444445 | 34.234 |
| 0.7763888888888889 | 34.234 |
| 0.7770833333333332 | 34.234 |
| 0.7777777777777778 | 34.234 |
| 0.7784722222222222 | 29.823 |
| 0.7791666666666667 | 29.823 |
| 0.779861111111111 | 29.823 |
| 0.7805555555555556 | 29.823 |
| 0.78125 | 25.419 |
| 0.7819444444444444 | 25.419 |
| 0.782638888888889 | 25.419 |
| 0.7833333333333333 | 21.024 |
| 0.7840277777777778 | 21.024 |
| 0.7847222222222222 | 21.024 |
| 0.7854166666666668 | 16.636 |
| 0.7861111111111111 | 16.636 |
| 0.7868055555555555 | 16.636 |
| 0.7875 | 16.636 |
| 0.7881944444444445 | 12.257 |
| 0.7888888888888889 | 12.257 |
| 0.7895833333333333 | 12.257 |
| 0.7902777777777777 | 12.257 |
| 0.7909722222222223 | 12.257 |
| 0.7916666666666666 | 12.257 |
| 0.7923611111111111 | 12.257 |
| 0.7930555555555556 | 12.257 |
| 0.7937500000000001 | 12.257 |
| 0.7944444444444444 | 12.257 |
| 0.7951388888888888 | 7.887 |
| 0.7958333333333334 | 7.887 |
| 0.7965277777777778 | 7.887 |
| 0.7972222222222222 | 7.887 |
| 0.7979166666666666 | 7.887 |
| 0.7986111111111112 | 7.887 |
| 0.7993055555555556 | 7.887 |
| 0.7999999999999999 | 7.887 |
| 0.8006944444444444 | 3.525 |
| 0.8013888888888889 | 3.525 |
| 0.8020833333333334 | 3.525 |
| 0.8027777777777777 | 3.525 |
| 0.8034722222222223 | 3.525 |
| 0.8041666666666667 | 3.525 |
| 0.8048611111111111 | 3.525 |
| 0.8055555555555555 | 3.525 |
| 0.80625 | 0 |
| 0.8069444444444445 | 0 |
| 0.8076388888888889 | 0 |
| 0.8083333333333332 | 0 |
| 0.8090277777777778 | 0 |
| 0.8097222222222222 | 0 |
| 0.8104166666666667 | 0 |
| 0.811111111111111 | 0 |
| 0.8118055555555556 | 0 |
| 0.8125 | 0 |
| 0.8131944444444444 | 0 |
| 0.813888888888889 | 0 |
| 0.8145833333333333 | 0 |
| 0.8152777777777778 | 0 |
| 0.8159722222222222 | 0 |
| 0.8166666666666668 | 0 |
| 0.8173611111111111 | 0 |
| 0.8180555555555555 | 0 |
| 0.81875 | 0 |
| 0.8194444444444445 | 0 |
| 0.8201388888888889 | 0 |
| 0.8208333333333333 | 0 |
| 0.8215277777777777 | 0 |
| 0.8222222222222223 | 0 |
| 0.8229166666666666 | 0 |
| 0.8236111111111111 | 0 |
| 0.8243055555555556 | 0 |
| 0.8250000000000001 | 0 |
| 0.8256944444444444 | 0 |
| 0.8263888888888888 | 0 |
| 0.8270833333333334 | 0 |
| 0.8277777777777778 | 0 |
| 0.8284722222222222 | 0 |
| 0.8291666666666666 | 0 |
| 0.8298611111111112 | 0 |
| 0.8305555555555556 | 0 |
| 0.8312499999999999 | 0 |
| 0.8319444444444444 | 0 |
| 0.8326388888888889 | 0 |
| 0.8333333333333334 | 0 |
| 0.8340277777777777 | 0 |
| 0.8347222222222223 | 0 |
| 0.8354166666666667 | 0 |
| 0.8361111111111111 | 0 |
| 0.8368055555555555 | 0 |
| 0.8375 | 0 |
| 0.8381944444444445 | 0 |
| 0.8388888888888889 | 0 |
| 0.8395833333333332 | 0 |
| 0.8402777777777778 | 0 |
| 0.8409722222222222 | 0 |
| 0.8416666666666667 | 0 |
| 0.842361111111111 | 0 |
| 0.8430555555555556 | 0 |
| 0.84375 | 0 |
| 0.8444444444444444 | 0 |
| 0.845138888888889 | 0 |
| 0.8458333333333333 | 0 |
| 0.8465277777777778 | 0 |
| 0.8472222222222222 | 0 |
| 0.8479166666666668 | 0 |
| 0.8486111111111111 | 0 |
| 0.8493055555555555 | 0 |
| 0.85 | 0 |
| 0.8506944444444445 | 0 |
| 0.8513888888888889 | 0 |
| 0.8520833333333333 | 0 |
| 0.8527777777777777 | 0 |
| 0.8534722222222223 | 0 |
| 0.8541666666666666 | 0 |
| 0.8548611111111111 | 0 |
| 0.8555555555555556 | 0 |
| 0.8562500000000001 | 0 |
| 0.8569444444444444 | 0 |
| 0.8576388888888888 | 0 |
| 0.8583333333333334 | 0 |
| 0.8590277777777778 | 0 |
| 0.8597222222222222 | 0 |
| 0.8604166666666666 | 0 |
| 0.8611111111111112 | 0 |
| 0.8618055555555556 | 0 |
| 0.8624999999999999 | 0 |
| 0.8631944444444444 | 0 |
| 0.8638888888888889 | 0 |
| 0.8645833333333334 | 0 |
| 0.8652777777777777 | 0 |
| 0.8659722222222223 | 0 |
| 0.8666666666666667 | 0 |
| 0.8673611111111111 | 0 |
| 0.8680555555555555 | 0 |
| 0.86875 | 0 |
| 0.8694444444444445 | 0 |
| 0.8701388888888889 | 0 |
| 0.8708333333333332 | 0 |
| 0.8715277777777778 | 0 |
| 0.8722222222222222 | 0 |
| 0.8729166666666667 | 0 |
| 0.873611111111111 | 0 |
| 0.8743055555555556 | 0 |
| 0.875 | 0 |
| 0.8756944444444444 | 0 |
| 0.876388888888889 | 0 |
| 0.8770833333333333 | 0 |
| 0.8777777777777778 | 0 |
| 0.8784722222222222 | 0 |
| 0.8791666666666668 | 0 |
| 0.8798611111111111 | 0 |
| 0.8805555555555555 | 0 |
| 0.88125 | 0 |
| 0.8819444444444445 | 0 |
| 0.8826388888888889 | 0 |
| 0.8833333333333333 | 0 |
| 0.8840277777777777 | 0 |
| 0.8847222222222223 | 0 |
| 0.8854166666666666 | 0 |
| 0.8861111111111111 | 0 |
| 0.8868055555555556 | 0 |
| 0.8875000000000001 | 0 |
| 0.8881944444444444 | 0 |
| 0.8888888888888888 | 0 |
| 0.8895833333333334 | 0 |
| 0.8902777777777778 | 0 |
| 0.8909722222222222 | 0 |
| 0.8916666666666666 | 0 |
| 0.8923611111111112 | 0 |
| 0.8930555555555556 | 0 |
| 0.8937499999999999 | 0 |
| 0.8944444444444444 | 0 |
| 0.8951388888888889 | 0 |
| 0.8958333333333334 | 0 |
| 0.8965277777777777 | 0 |
| 0.8972222222222223 | 0 |
| 0.8979166666666667 | 0 |
| 0.8986111111111111 | 0 |
| 0.8993055555555555 | 0 |
| 0.9 | 0 |
| 0.9006944444444445 | 0 |
| 0.9013888888888889 | 0 |
| 0.9020833333333332 | 0 |
| 0.9027777777777778 | 0 |
| 0.9034722222222222 | 0 |
| 0.9041666666666667 | 0 |
| 0.904861111111111 | 0 |
| 0.9055555555555556 | 0 |
| 0.90625 | 0 |
| 0.9069444444444444 | 0 |
| 0.907638888888889 | 0 |
| 0.9083333333333333 | 0 |
| 0.9090277777777778 | 0 |
| 0.9097222222222222 | 0 |
| 0.9104166666666668 | 0 |
| 0.9111111111111111 | 0 |
| 0.9118055555555555 | 0 |
| 0.9125 | 0 |
| 0.9131944444444445 | 0 |
| 0.9138888888888889 | 0 |
| 0.9145833333333333 | 0 |
| 0.9152777777777777 | 0 |
| 0.9159722222222223 | 0 |
| 0.9166666666666666 | 0 |
| 0.9173611111111111 | 0 |
| 0.9180555555555556 | 0 |
| 0.9187500000000001 | 0 |
| 0.9194444444444444 | 0 |
| 0.9201388888888888 | 0 |
| 0.9208333333333334 | 0 |
| 0.9215277777777778 | 0 |
| 0.9222222222222222 | 0 |
| 0.9229166666666666 | 0 |
| 0.9236111111111112 | 0 |
| 0.9243055555555556 | 0 |
| 0.9249999999999999 | 0 |
| 0.9256944444444444 | 0 |
| 0.9263888888888889 | 0 |
| 0.9270833333333334 | 0 |
| 0.9277777777777777 | 0 |
| 0.9284722222222223 | 0 |
| 0.9291666666666667 | 0 |
| 0.9298611111111111 | 0 |
| 0.9305555555555555 | 0 |
| 0.93125 | 0 |
| 0.9319444444444445 | 0 |
| 0.9326388888888889 | 0 |
| 0.9333333333333332 | 0 |
| 0.9340277777777778 | 0 |
| 0.9347222222222222 | 0 |
| 0.9354166666666667 | 0 |
| 0.936111111111111 | 0 |
| 0.9368055555555556 | 0 |
| 0.9375 | 0 |
| 0.9381944444444444 | 0 |
| 0.938888888888889 | 0 |
| 0.9395833333333333 | 0 |
| 0.9402777777777778 | 0 |
| 0.9409722222222222 | 0 |
| 0.9416666666666668 | 0 |
| 0.9423611111111111 | 0 |
| 0.9430555555555555 | 0 |
| 0.94375 | 0 |
| 0.9444444444444445 | 0 |
| 0.9451388888888889 | 0 |
| 0.9458333333333333 | 0 |
| 0.9465277777777777 | 0 |
| 0.9472222222222223 | 0 |
| 0.9479166666666666 | 0 |
| 0.9486111111111111 | 0 |
| 0.9493055555555556 | 0 |
| 0.9500000000000001 | 0 |
| 0.9506944444444444 | 0 |
| 0.9513888888888888 | 0 |
| 0.9520833333333334 | 0 |
| 0.9527777777777778 | 0 |
| 0.9534722222222222 | 0 |
| 0.9541666666666666 | 0 |
| 0.9548611111111112 | 0 |
| 0.9555555555555556 | 0 |
| 0.9562499999999999 | 0 |
| 0.9569444444444444 | 0 |
| 0.9576388888888889 | 0 |
| 0.9583333333333334 | 0 |
| 0.9590277777777777 | 0 |
| 0.9597222222222223 | 0 |
| 0.9604166666666667 | 0 |
| 0.9611111111111111 | 0 |
| 0.9618055555555555 | 0 |
| 0.9625 | 0 |
| 0.9631944444444445 | 0 |
| 0.9638888888888889 | 0 |
| 0.9645833333333332 | 0 |
| 0.9652777777777778 | 0 |
| 0.9659722222222222 | 0 |
| 0.9666666666666667 | 0 |
| 0.967361111111111 | 0 |
| 0.9680555555555556 | 0 |
| 0.96875 | 0 |
| 0.9694444444444444 | 0 |
| 0.970138888888889 | 0 |
| 0.9708333333333333 | 0 |
| 0.9715277777777778 | 0 |
| 0.9722222222222222 | 0 |
| 0.9729166666666668 | 0 |
| 0.9736111111111111 | 0 |
| 0.9743055555555555 | 0 |
| 0.975 | 0 |
| 0.9756944444444445 | 0 |
| 0.9763888888888889 | 0 |
| 0.9770833333333333 | 0 |
| 0.9777777777777777 | 0 |
| 0.9784722222222223 | 0 |
| 0.9791666666666666 | 0 |
| 0.9798611111111111 | 0 |
| 0.9805555555555556 | 0 |
| 0.9812500000000001 | 0 |
| 0.9819444444444444 | 0 |
| 0.9826388888888888 | 0 |
| 0.9833333333333334 | 0 |
| 0.9840277777777778 | 0 |
| 0.9847222222222222 | 0 |
| 0.9854166666666666 | 0 |
| 0.9861111111111112 | 0 |
| 0.9868055555555556 | 0 |
| 0.9874999999999999 | 0 |
| 0.9881944444444444 | 0 |
| 0.9888888888888889 | 0 |
| 0.9895833333333334 | 0 |
| 0.9902777777777777 | 0 |
| 0.9909722222222223 | 0 |
| 0.9916666666666667 | 0 |
| 0.9923611111111111 | 0 |
| 0.9930555555555555 | 0 |
| 0.99375 | 0 |
| 0.9944444444444445 | 0 |
| 0.9951388888888889 | 0 |
| 0.9958333333333332 | 0 |
| 0.9965277777777778 | 0 |
| 0.9972222222222222 | 0 |
| 0.9979166666666667 | 0 |
| 0.998611111111111 | 0 |
| 0.9993055555555556 | 0 |